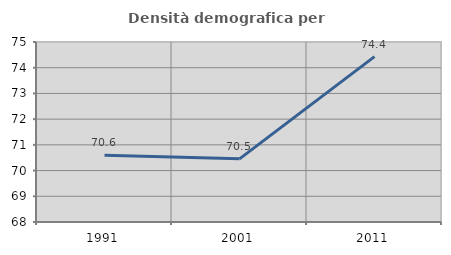
| Category | Densità demografica |
|---|---|
| 1991.0 | 70.598 |
| 2001.0 | 70.456 |
| 2011.0 | 74.433 |